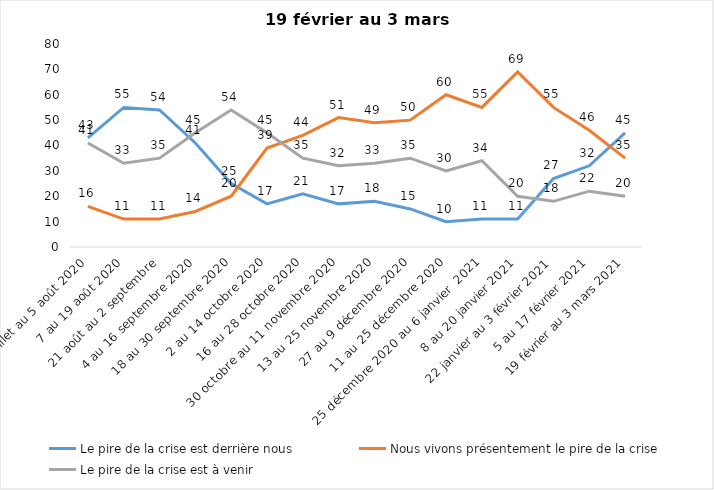
| Category | Le pire de la crise est derrière nous | Nous vivons présentement le pire de la crise | Le pire de la crise est à venir |
|---|---|---|---|
| 24 juillet au 5 août 2020 | 43 | 16 | 41 |
| 7 au 19 août 2020 | 55 | 11 | 33 |
| 21 août au 2 septembre | 54 | 11 | 35 |
| 4 au 16 septembre 2020 | 41 | 14 | 45 |
| 18 au 30 septembre 2020 | 25 | 20 | 54 |
| 2 au 14 octobre 2020 | 17 | 39 | 45 |
| 16 au 28 octobre 2020 | 21 | 44 | 35 |
| 30 octobre au 11 novembre 2020 | 17 | 51 | 32 |
| 13 au 25 novembre 2020 | 18 | 49 | 33 |
| 27 au 9 décembre 2020 | 15 | 50 | 35 |
| 11 au 25 décembre 2020 | 10 | 60 | 30 |
| 25 décembre 2020 au 6 janvier  2021 | 11 | 55 | 34 |
| 8 au 20 janvier 2021 | 11 | 69 | 20 |
| 22 janvier au 3 février 2021 | 27 | 55 | 18 |
| 5 au 17 février 2021 | 32 | 46 | 22 |
| 19 février au 3 mars 2021 | 45 | 35 | 20 |